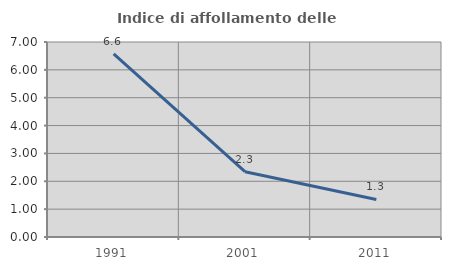
| Category | Indice di affollamento delle abitazioni  |
|---|---|
| 1991.0 | 6.577 |
| 2001.0 | 2.343 |
| 2011.0 | 1.348 |